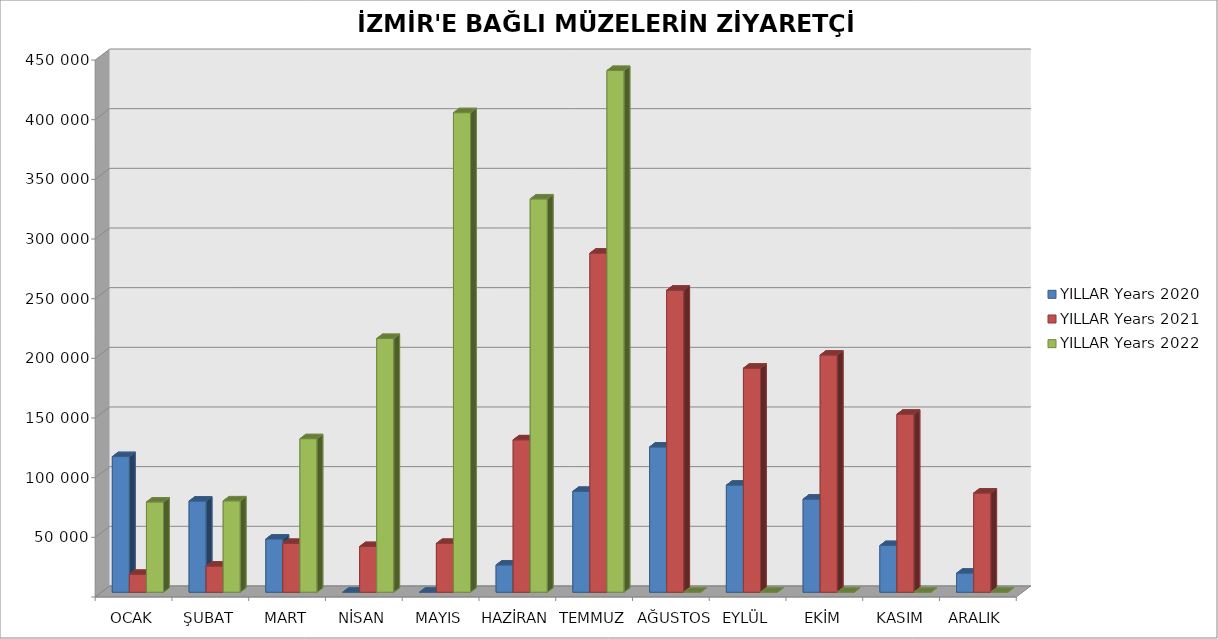
| Category | YILLAR |
|---|---|
| OCAK | 75648 |
| ŞUBAT | 76569 |
| MART | 128664 |
| NİSAN | 212657 |
| MAYIS | 401887 |
| HAZİRAN | 329617 |
| TEMMUZ | 437234 |
| AĞUSTOS | 0 |
| EYLÜL | 0 |
| EKİM | 0 |
| KASIM | 0 |
| ARALIK | 0 |